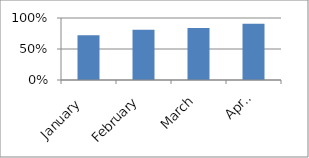
| Category | ACCURACY |
|---|---|
| January  | 0.72 |
| February | 0.81 |
| March | 0.84 |
| April | 0.906 |